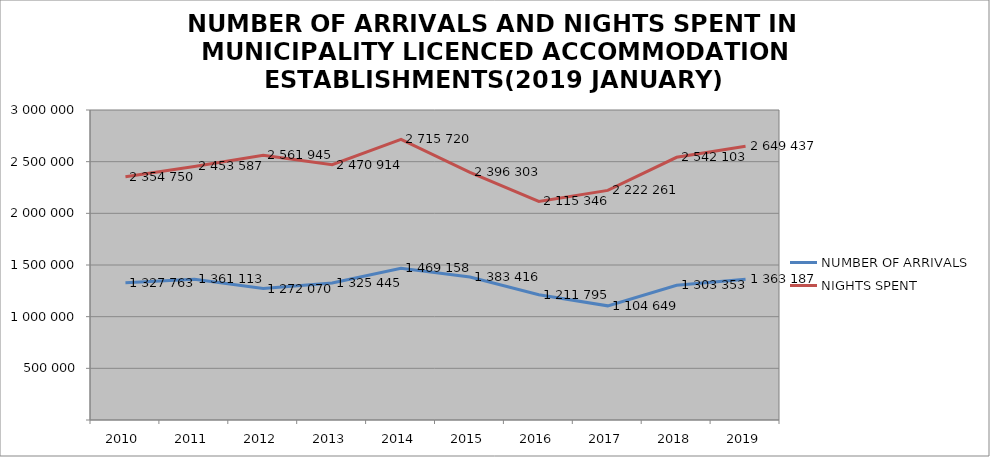
| Category | NUMBER OF ARRIVALS | NIGHTS SPENT |
|---|---|---|
| 2010 | 1327763 | 2354750 |
| 2011 | 1361113 | 2453587 |
| 2012 | 1272070 | 2561945 |
| 2013 | 1325445 | 2470914 |
| 2014 | 1469158 | 2715720 |
| 2015 | 1383416 | 2396303 |
| 2016 | 1211795 | 2115346 |
| 2017 | 1104649 | 2222261 |
| 2018 | 1303353 | 2542103 |
| 2019 | 1363187 | 2649437 |